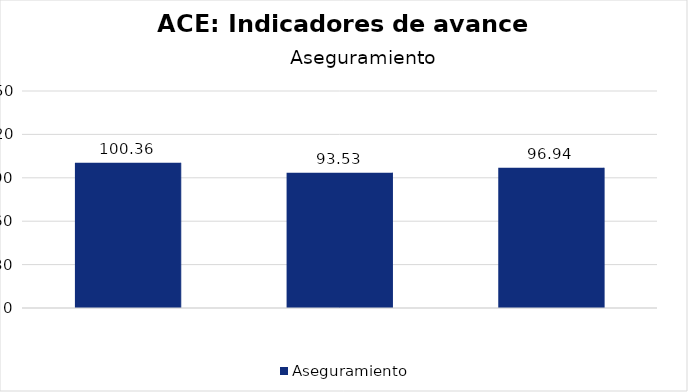
| Category | Aseguramiento |
|---|---|
| Índice avance beneficiarios (IAB)  | 100.359 |
| Índice avance gasto (IAG) | 93.528 |
| Índice avance total (IAT)  | 96.943 |